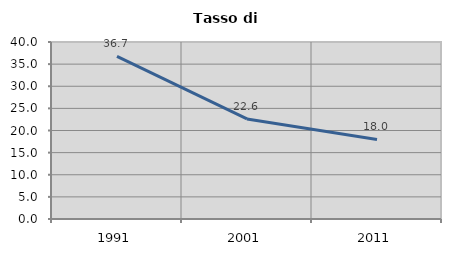
| Category | Tasso di disoccupazione   |
|---|---|
| 1991.0 | 36.732 |
| 2001.0 | 22.606 |
| 2011.0 | 17.972 |